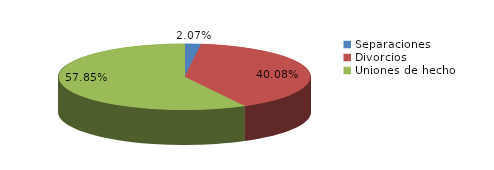
| Category | Series 0 |
|---|---|
| Separaciones | 72 |
| Divorcios | 1396 |
| Uniones de hecho | 2015 |